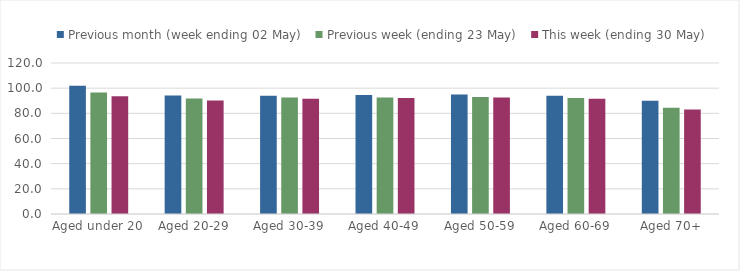
| Category | Previous month (week ending 02 May) | Previous week (ending 23 May) | This week (ending 30 May) |
|---|---|---|---|
| Aged under 20 | 102.011 | 96.579 | 93.553 |
| Aged 20-29 | 94.13 | 91.752 | 90.128 |
| Aged 30-39 | 94.007 | 92.484 | 91.651 |
| Aged 40-49 | 94.524 | 92.553 | 92.25 |
| Aged 50-59 | 94.933 | 92.957 | 92.608 |
| Aged 60-69 | 93.97 | 92.119 | 91.596 |
| Aged 70+ | 90.061 | 84.503 | 83.119 |